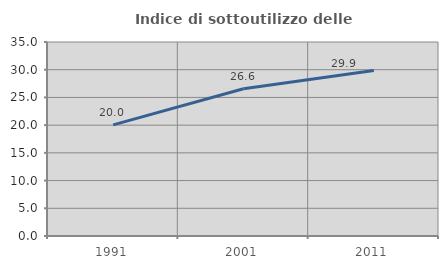
| Category | Indice di sottoutilizzo delle abitazioni  |
|---|---|
| 1991.0 | 20.049 |
| 2001.0 | 26.565 |
| 2011.0 | 29.852 |